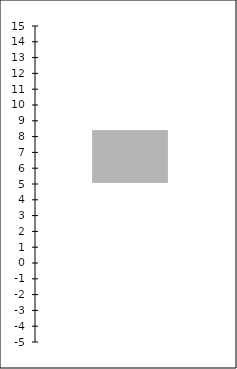
| Category | Series 0 | Series 1 | Series 2 | Series 3 |
|---|---|---|---|---|
| 0 | 5.102 | 6.227 | 8.392 | 8.392 |